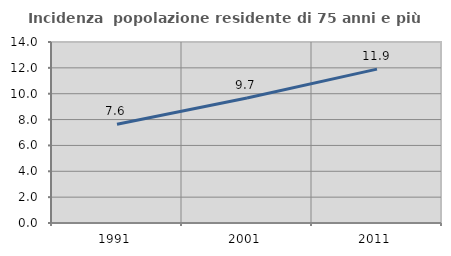
| Category | Incidenza  popolazione residente di 75 anni e più |
|---|---|
| 1991.0 | 7.641 |
| 2001.0 | 9.665 |
| 2011.0 | 11.904 |